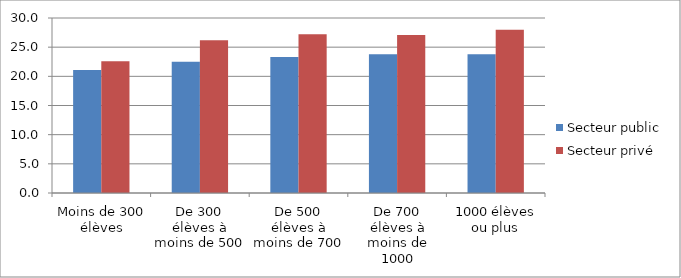
| Category | Secteur public | Secteur privé |
|---|---|---|
| Moins de 300 élèves | 21.1 | 22.6 |
| De 300 élèves à moins de 500  | 22.5 | 26.2 |
| De 500 élèves à moins de 700 | 23.3 | 27.2 |
| De 700 élèves à moins de 1000 | 23.8 | 27.1 |
| 1000 élèves ou plus | 23.8 | 28 |